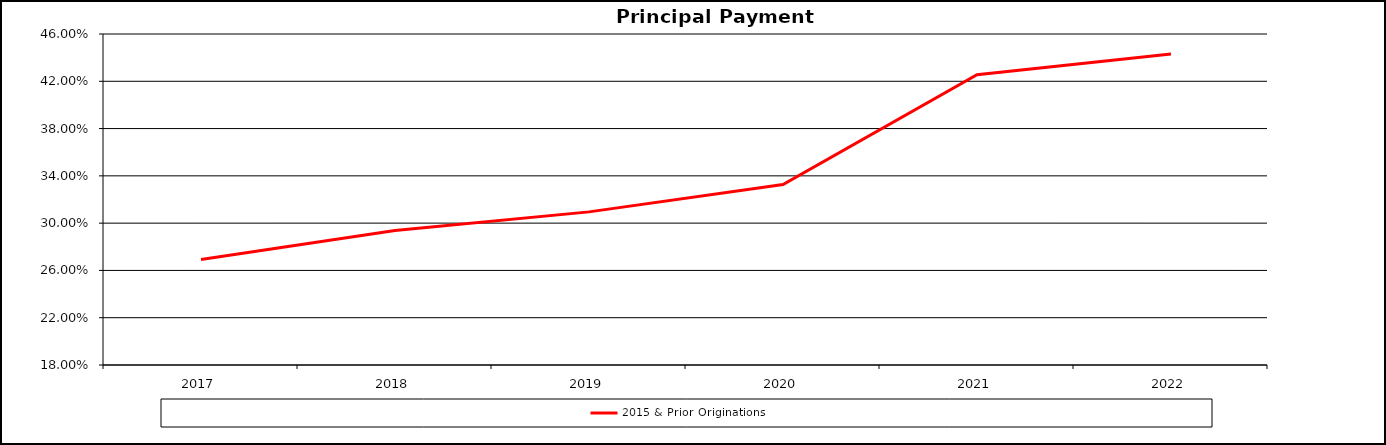
| Category | 2015 & Prior Originations |
|---|---|
| 2017.0 | 0.269 |
| 2018.0 | 0.294 |
| 2019.0 | 0.31 |
| 2020.0 | 0.333 |
| 2021.0 | 0.426 |
| 2022.0 | 0.443 |